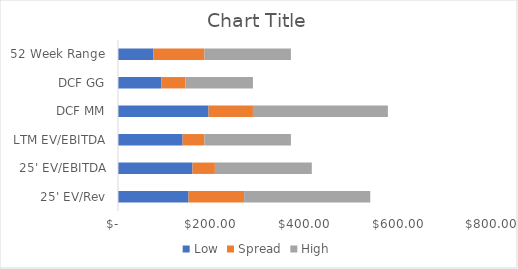
| Category | Low | Spread | High |
|---|---|---|---|
| 25' EV/Rev | 150.884 | 118.904 | 269.788 |
| 25' EV/EBITDA | 159.345 | 47.937 | 207.282 |
| LTM EV/EBITDA | 138.207 | 46.741 | 184.948 |
| DCF MM | 193.581 | 95.065 | 288.646 |
| DCF GG | 92.566 | 51.744 | 144.31 |
| 52 Week Range | 75.92 | 109 | 184.92 |